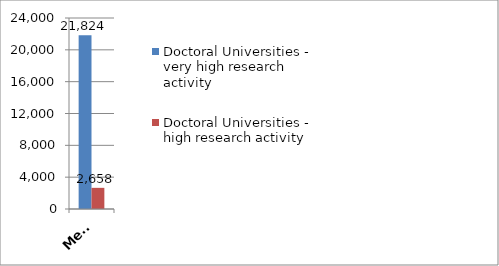
| Category | Doctoral Universities - very high research activity | Doctoral Universities - high research activity |
|---|---|---|
| Median Non-S&E R&D Expenditures (1000s) | 21823.5 | 2658 |